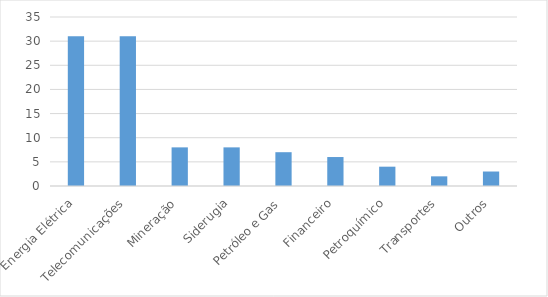
| Category | Series 0 |
|---|---|
| Energia Elétrica | 31 |
| Telecomunicações | 31 |
| Mineração | 8 |
| Siderugia | 8 |
| Petróleo e Gas | 7 |
| Financeiro | 6 |
| Petroquímico | 4 |
| Transportes | 2 |
| Outros | 3 |